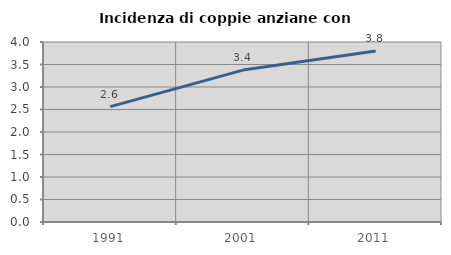
| Category | Incidenza di coppie anziane con figli |
|---|---|
| 1991.0 | 2.564 |
| 2001.0 | 3.376 |
| 2011.0 | 3.799 |